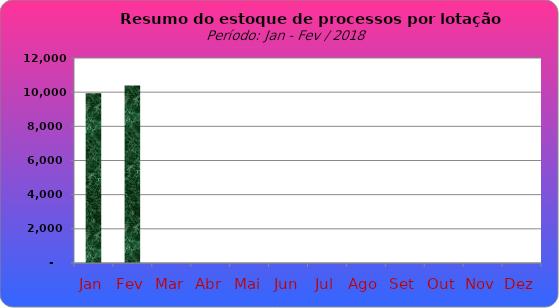
| Category | Series 0 |
|---|---|
| Jan | 9933 |
| Fev | 10393 |
| Mar | 0 |
| Abr | 0 |
| Mai | 0 |
| Jun | 0 |
| Jul | 0 |
| Ago | 0 |
| Set | 0 |
| Out | 0 |
| Nov | 0 |
| Dez | 0 |